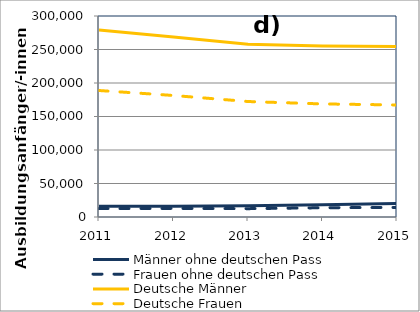
| Category | Männer ohne deutschen Pass | Frauen ohne deutschen Pass | Deutsche Männer | Deutsche Frauen |
|---|---|---|---|---|
| 2011.0 | 15999 | 12549 | 279246 | 188796 |
| 2012.0 | 15897 | 12837 | 268737 | 181371 |
| 2013.0 | 16797 | 12456 | 257667 | 172353 |
| 2014.0 | 18252 | 13815 | 255039 | 168756 |
| 2015.0 | 20121 | 14310 | 254553 | 167253 |